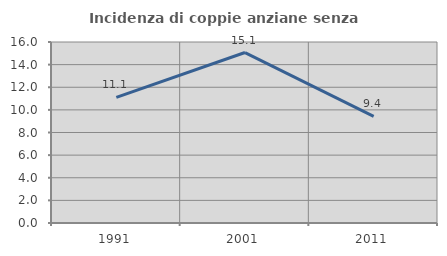
| Category | Incidenza di coppie anziane senza figli  |
|---|---|
| 1991.0 | 11.111 |
| 2001.0 | 15.068 |
| 2011.0 | 9.42 |